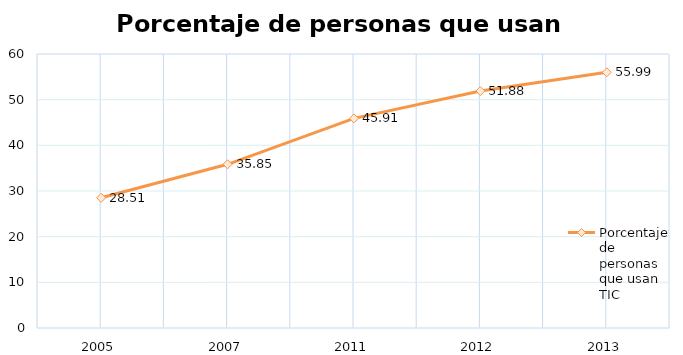
| Category | Porcentaje de personas que usan TIC |
|---|---|
| 2005.0 | 28.513 |
| 2007.0 | 35.847 |
| 2011.0 | 45.906 |
| 2012.0 | 51.885 |
| 2013.0 | 55.99 |